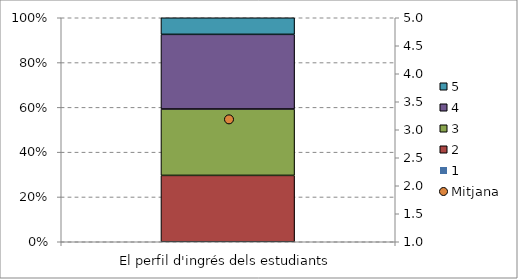
| Category | 1 | 2 | 3 | 4 | 5 |
|---|---|---|---|---|---|
| El perfil d'ingrés dels estudiants | 0 | 0.296 | 0.296 | 0.333 | 0.074 |